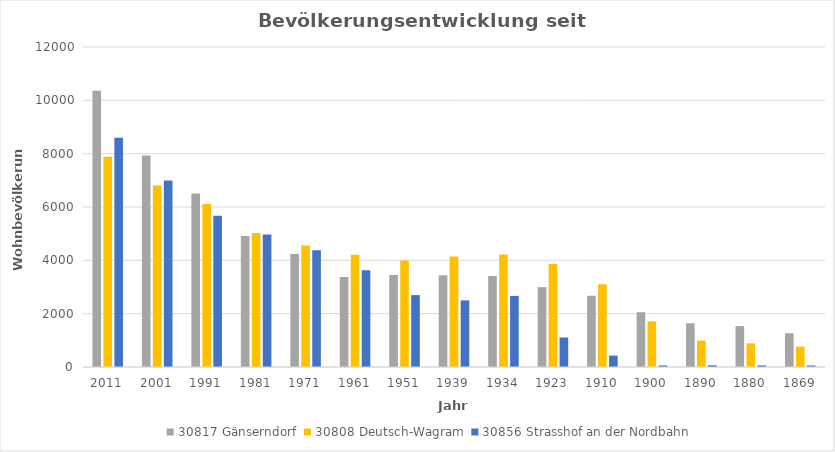
| Category | 30817 | 30808 | 30856 |
|---|---|---|---|
| 2011 | 10362 | 7882 | 8595 |
| 2001 | 7928 | 6808 | 6993 |
| 1991 | 6509 | 6111 | 5673 |
| 1981 | 4916 | 5021 | 4973 |
| 1971 | 4238 | 4558 | 4377 |
| 1961 | 3378 | 4207 | 3624 |
| 1951 | 3449 | 3996 | 2697 |
| 1939 | 3437 | 4144 | 2499 |
| 1934 | 3410 | 4219 | 2665 |
| 1923 | 2993 | 3865 | 1106 |
| 1910 | 2674 | 3101 | 427 |
| 1900 | 2054 | 1709 | 59 |
| 1890 | 1642 | 991 | 65 |
| 1880 | 1534 | 887 | 61 |
| 1869 | 1267 | 763 | 56 |